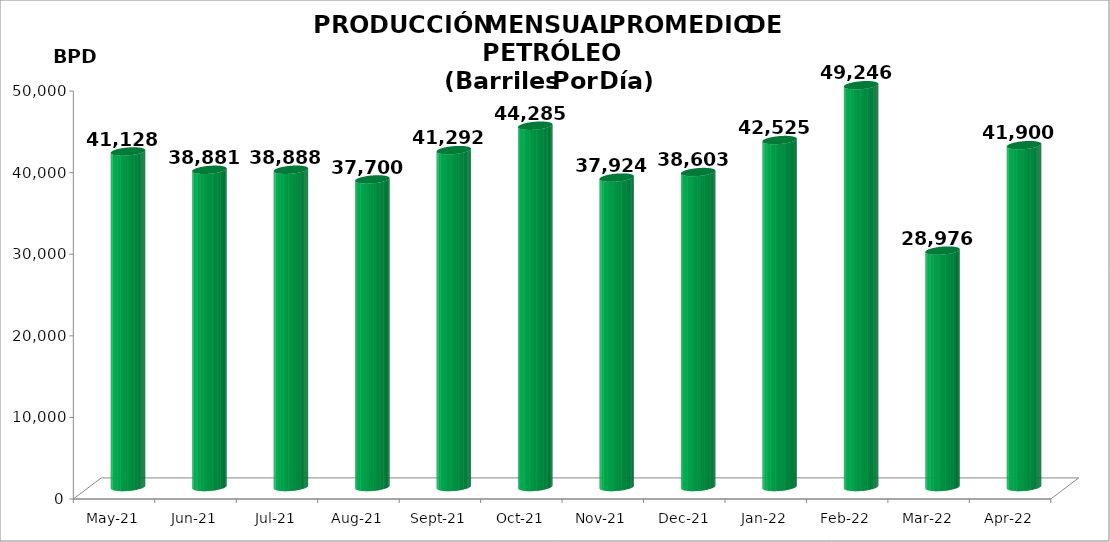
| Category | Series 0 |
|---|---|
| 2021-05-01 | 41128.032 |
| 2021-06-01 | 38881.4 |
| 2021-07-01 | 38887.645 |
| 2021-08-01 | 37699.645 |
| 2021-09-01 | 41292 |
| 2021-10-01 | 44285 |
| 2021-11-01 | 37924 |
| 2021-12-01 | 38603 |
| 2022-01-01 | 42524.516 |
| 2022-02-01 | 49246 |
| 2022-03-01 | 28976.419 |
| 2022-04-01 | 41900 |